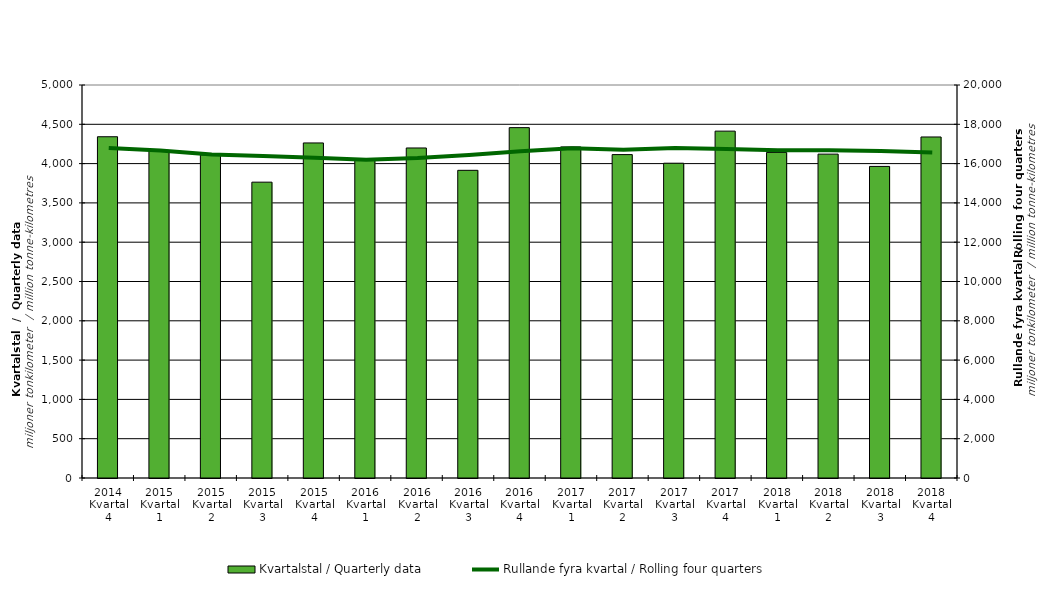
| Category | Kvartalstal / Quarterly data |
|---|---|
| 2014 Kvartal 4 | 4341.663 |
| 2015 Kvartal 1 | 4166.039 |
| 2015 Kvartal 2 | 4110.777 |
| 2015 Kvartal 3 | 3763.882 |
| 2015 Kvartal 4 | 4262.71 |
| 2016 Kvartal 1 | 4059.671 |
| 2016 Kvartal 2 | 4198.844 |
| 2016 Kvartal 3 | 3914.578 |
| 2016 Kvartal 4 | 4457.584 |
| 2017 Kvartal 1 | 4212.424 |
| 2017 Kvartal 2 | 4114.41 |
| 2017 Kvartal 3 | 4005.039 |
| 2017 Kvartal 4 | 4413.036 |
| 2018 Kvartal 1 | 4142.228 |
| 2018 Kvartal 2 | 4120.428 |
| 2018 Kvartal 3 | 3964.119 |
| 2018 Kvartal 4 | 4338.814 |